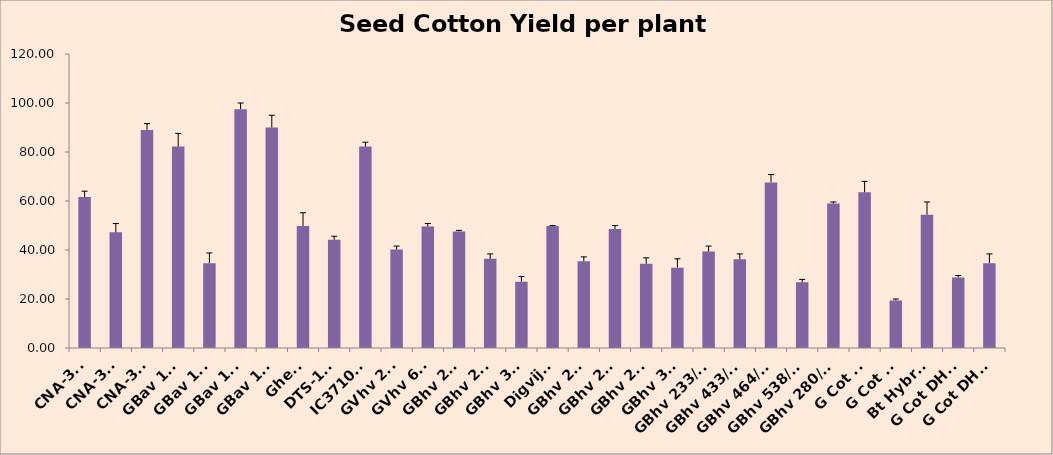
| Category | Seed Cotton Yield per plant (g) |
|---|---|
| CNA-347 | 61.6 |
| CNA-375 | 47.2 |
| CNA-398 | 89 |
| GBav 109 | 82.2 |
| GBav 120 | 34.6 |
| GBav 124 | 97.5 |
| GBav 131 | 90 |
| Gheti | 49.8 |
| DTS-123 | 44.2 |
| IC371099 | 82.2 |
| GVhv 235 | 40.2 |
| GVhv 682 | 49.6 |
| GBhv 287 | 47.6 |
| GBhv 297 | 36.4 |
| GBhv 305 | 27 |
| Digvijay | 49.8 |
| GBhv 280 | 35.4 |
| GBhv 293 | 48.6 |
| GBhv 291 | 34.4 |
| GBhv 306 | 32.8 |
| GBhv 233/09 | 39.4 |
| GBhv 433/08 | 36.2 |
| GBhv 464/08 | 67.6 |
| GBhv 538/08 | 26.8 |
| GBhv 280/11 | 59 |
| G Cot 23 | 63.6 |
| G Cot 25 | 19.4 |
| Bt Hybrid | 54.4 |
| G Cot DH-7 | 28.8 |
| G Cot DH-9 | 34.6 |